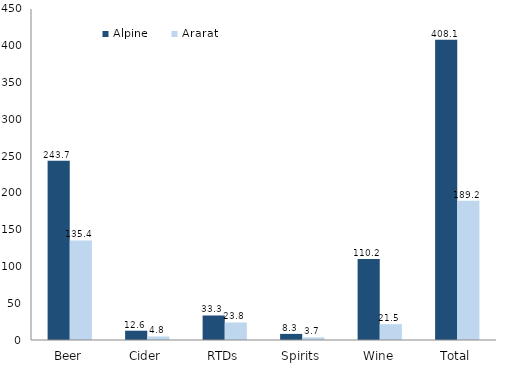
| Category | Alpine | Ararat |
|---|---|---|
| Beer | 243.692 | 135.37 |
| Cider | 12.638 | 4.81 |
| RTDs | 33.32 | 23.833 |
| Spirits | 8.31 | 3.682 |
| Wine | 110.178 | 21.505 |
| Total | 408.137 | 189.2 |